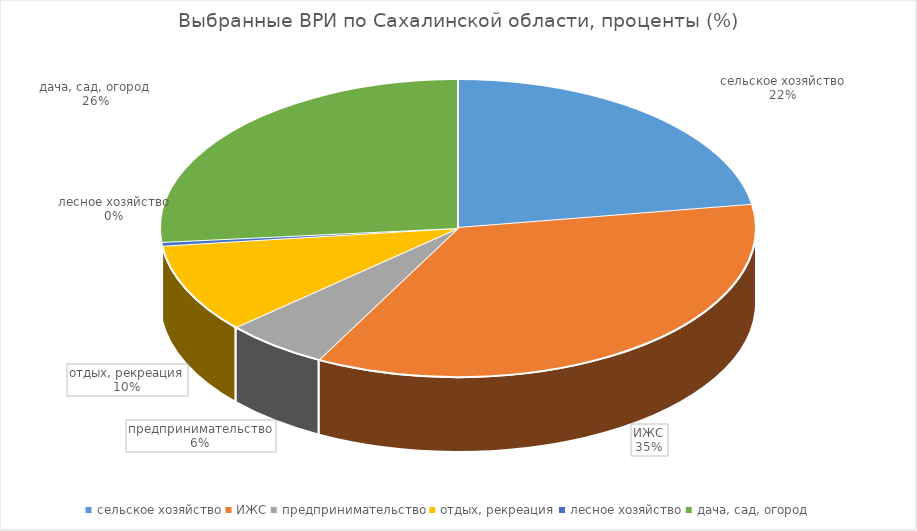
| Category | Сахалинская область |
|---|---|
| сельское хозяйство | 22.494 |
| ИЖС | 35.241 |
| предпринимательство | 5.662 |
| отдых, рекреация | 9.715 |
| лесное хозяйство | 0.402 |
| дача, сад, огород | 26.485 |